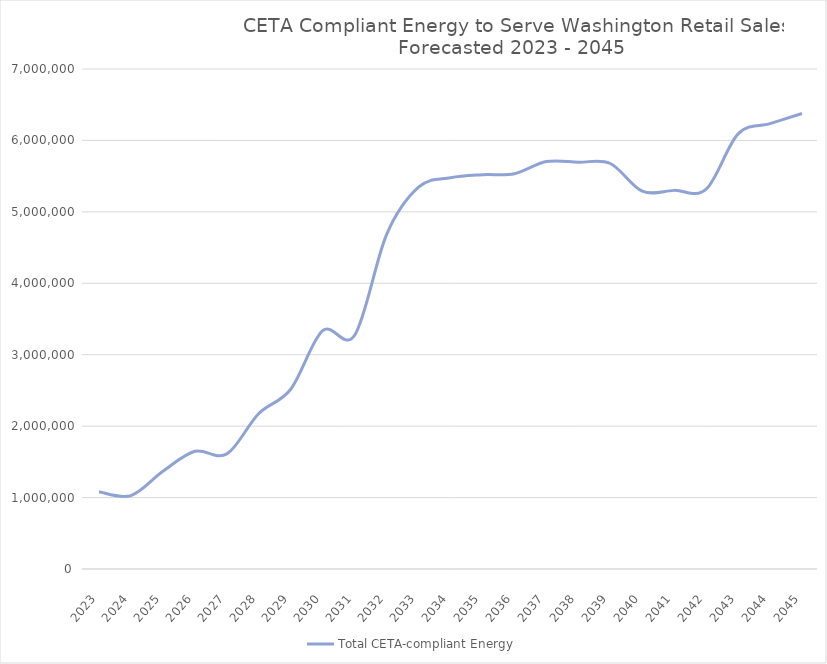
| Category | Total CETA-compliant Energy |
|---|---|
| 2023.0 | 1081277.448 |
| 2024.0 | 1028235.651 |
| 2025.0 | 1367667.323 |
| 2026.0 | 1648264.943 |
| 2027.0 | 1611189.296 |
| 2028.0 | 2177022.298 |
| 2029.0 | 2516107.711 |
| 2030.0 | 3336333.826 |
| 2031.0 | 3272800.625 |
| 2032.0 | 4682295.881 |
| 2033.0 | 5345139.699 |
| 2034.0 | 5477657.39 |
| 2035.0 | 5520106.72 |
| 2036.0 | 5534440.72 |
| 2037.0 | 5704340.25 |
| 2038.0 | 5695378.043 |
| 2039.0 | 5677019.091 |
| 2040.0 | 5289011.877 |
| 2041.0 | 5300748.244 |
| 2042.0 | 5317273.946 |
| 2043.0 | 6091255.709 |
| 2044.0 | 6234484.038 |
| 2045.0 | 6377712.366 |